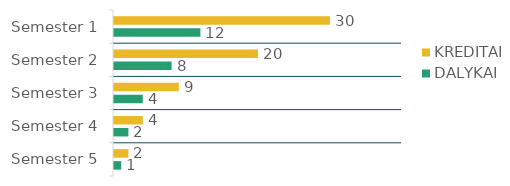
| Category | CREDITS   | CLASSES  |
|---|---|---|
| Semester 1 | 30 | 12 |
| Semester 2 | 20 | 8 |
| Semester 3 | 9 | 4 |
| Semester 4 | 4 | 2 |
| Semester 5 | 2 | 1 |